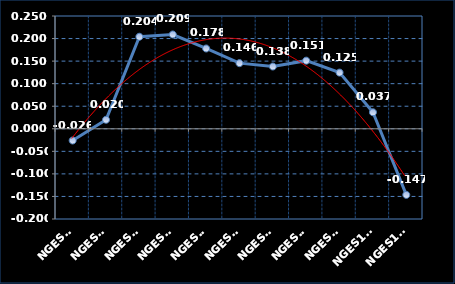
| Category | Series 0 |
|---|---|
| NGES1F | -0.026 |
| NGES2F | 0.02 |
| NGES3F | 0.204 |
| NGES4F | 0.209 |
| NGES5F | 0.178 |
| NGES6F | 0.146 |
| NGES7F | 0.138 |
| NGES8F | 0.151 |
| NGES9F | 0.124 |
| NGES10F | 0.037 |
| NGES11F | -0.147 |